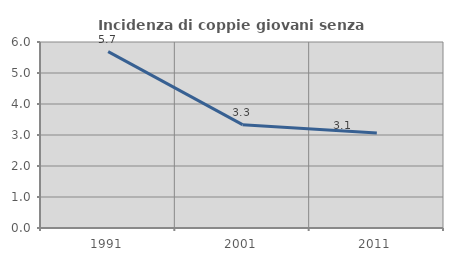
| Category | Incidenza di coppie giovani senza figli |
|---|---|
| 1991.0 | 5.691 |
| 2001.0 | 3.333 |
| 2011.0 | 3.065 |